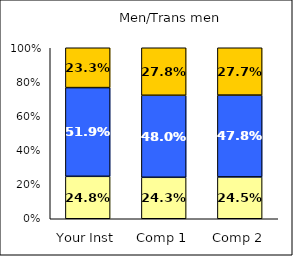
| Category | Low Career Related Stress | Average Career Related Stress | High Career Related Stress |
|---|---|---|---|
| Your Inst | 0.248 | 0.519 | 0.233 |
| Comp 1 | 0.243 | 0.48 | 0.278 |
| Comp 2 | 0.245 | 0.478 | 0.277 |